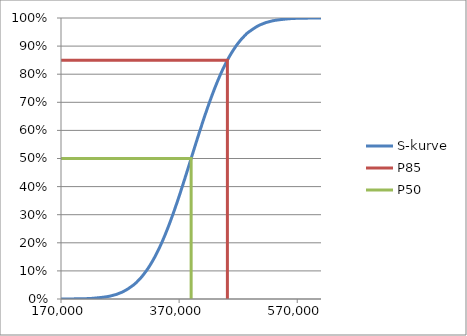
| Category | S-kurve |
|---|---|
| 170025.52427726632 | 0 |
| 195409.00220704256 | 0 |
| 207274.32472091704 | 0.001 |
| 224050.83750354985 | 0.002 |
| 252526.38371281873 | 0.01 |
| 274230.7472056149 | 0.025 |
| 292897.697192871 | 0.05 |
| 305060.8594795728 | 0.075 |
| 314419.4950241044 | 0.1 |
| 322191.8343642112 | 0.125 |
| 328940.14984587324 | 0.15 |
| 334973.3336049145 | 0.175 |
| 340480.70598408976 | 0.2 |
| 345587.5103777644 | 0.225 |
| 350381.4755600763 | 0.25 |
| 354926.89281508874 | 0.275 |
| 359272.67263545986 | 0.3 |
| 363457.24480913987 | 0.325 |
| 367511.6917790511 | 0.35 |
| 371461.84059017757 | 0.375 |
| 375329.71525088046 | 0.4 |
| 379134.58383065206 | 0.425 |
| 382893.7434371239 | 0.45 |
| 386623.1346203909 | 0.475 |
| 390337.84681419394 | 0.5 |
| 394052.559007997 | 0.525 |
| 397781.950191264 | 0.55 |
| 401541.1097977358 | 0.575 |
| 405345.9783775074 | 0.6 |
| 409213.8530382103 | 0.625 |
| 413164.0018493368 | 0.65 |
| 417218.44881924806 | 0.675 |
| 421403.020992928 | 0.7 |
| 425748.80081329914 | 0.725 |
| 430294.2180683116 | 0.75 |
| 435088.18325062346 | 0.775 |
| 440194.9876442981 | 0.8 |
| 445702.3600234734 | 0.825 |
| 451735.5437825145 | 0.85 |
| 458483.8592641767 | 0.875 |
| 466256.19860428345 | 0.9 |
| 469763.3768113204 | 0.91 |
| 473573.4495583617 | 0.92 |
| 477762.82873316377 | 0.93 |
| 482441.7089466444 | 0.94 |
| 487777.9964355169 | 0.95 |
| 506444.94642277295 | 0.975 |
| 528149.3099155691 | 0.99 |
| 556624.8561248385 | 0.998 |
| 573401.3689074708 | 0.999 |
| 585266.6914213472 | 1 |
| 610650.1693511233 | 1 |